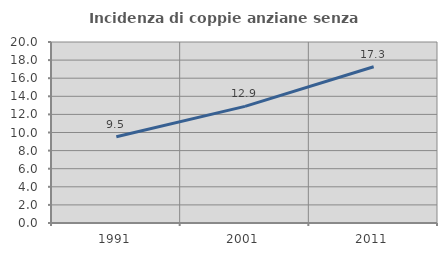
| Category | Incidenza di coppie anziane senza figli  |
|---|---|
| 1991.0 | 9.523 |
| 2001.0 | 12.884 |
| 2011.0 | 17.26 |